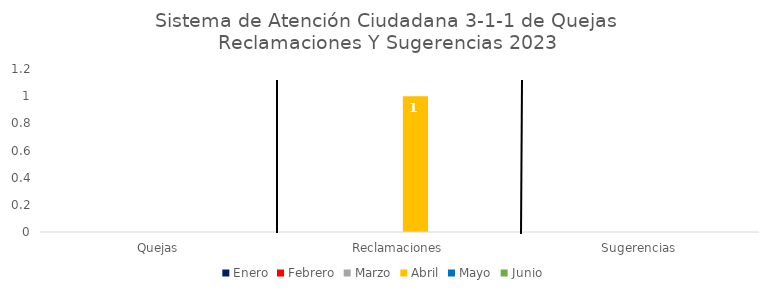
| Category | Enero | Febrero | Marzo | Abril | Mayo | Junio |
|---|---|---|---|---|---|---|
| Quejas | 0 | 0 | 0 | 0 | 0 | 0 |
| Reclamaciones | 0 | 0 | 0 | 1 | 0 | 0 |
| Sugerencias | 0 | 0 | 0 | 0 | 0 | 0 |